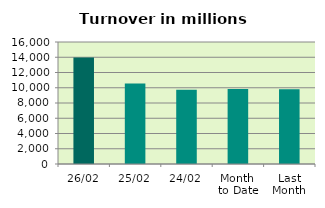
| Category | Series 0 |
|---|---|
| 26/02 | 13955.181 |
| 25/02 | 10564.763 |
| 24/02 | 9737.121 |
| Month 
to Date | 9824.278 |
| Last
Month | 9809.456 |